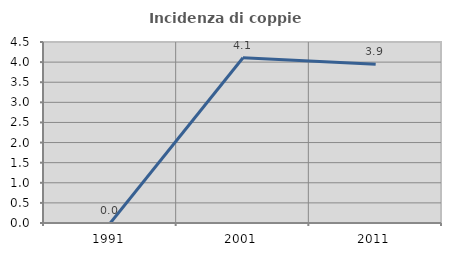
| Category | Incidenza di coppie miste |
|---|---|
| 1991.0 | 0 |
| 2001.0 | 4.11 |
| 2011.0 | 3.947 |